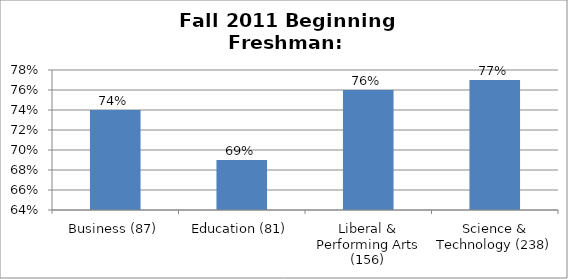
| Category | Series 0 |
|---|---|
| Business (87) | 0.74 |
| Education (81) | 0.69 |
| Liberal & Performing Arts (156) | 0.76 |
| Science & Technology (238) | 0.77 |